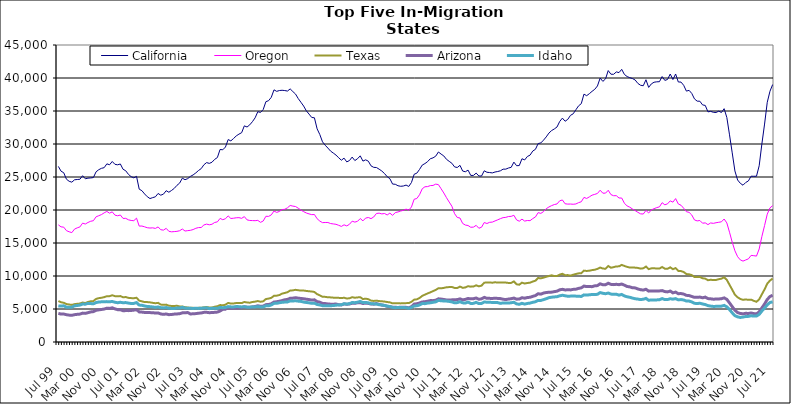
| Category | California | Oregon | Texas | Arizona | Idaho |
|---|---|---|---|---|---|
| Jul 99 | 26605 | 17749 | 6209 | 4339 | 5471 |
| Aug 99 | 25882 | 17447 | 6022 | 4228 | 5444 |
| Sep 99 | 25644 | 17401 | 5941 | 4237 | 5488 |
| Oct 99 | 24669 | 16875 | 5751 | 4134 | 5279 |
| Nov 99 | 24353 | 16701 | 5680 | 4073 | 5260 |
| Dec 99 | 24218 | 16570 | 5619 | 4042 | 5269 |
| Jan 00 | 24574 | 17109 | 5736 | 4142 | 5485 |
| Feb 00 | 24620 | 17295 | 5789 | 4192 | 5530 |
| Mar 00 | 24655 | 17436 | 5826 | 4226 | 5590 |
| Apr 00 | 25195 | 18009 | 5980 | 4375 | 5748 |
| May 00 | 24730 | 17875 | 5897 | 4337 | 5729 |
| Jun 00 | 24825 | 18113 | 6070 | 4444 | 5853 |
| Jul 00 | 24857 | 18294 | 6163 | 4555 | 5824 |
| Aug 00 | 24913 | 18376 | 6199 | 4603 | 5788 |
| Sep 00 | 25792 | 18971 | 6529 | 4804 | 5976 |
| Oct 00 | 26106 | 19135 | 6643 | 4870 | 6058 |
| Nov 00 | 26315 | 19306 | 6705 | 4926 | 6085 |
| Dec 00 | 26415 | 19570 | 6793 | 4991 | 6096 |
| Jan 01 | 26995 | 19781 | 6942 | 5122 | 6119 |
| Feb 01 | 26851 | 19519 | 6948 | 5089 | 6090 |
| Mar 01 | 27352 | 19720 | 7080 | 5180 | 6143 |
| Apr 01 | 26918 | 19221 | 6943 | 5020 | 6020 |
| May 01 | 26848 | 19126 | 6924 | 4899 | 5950 |
| Jun 01 | 26974 | 19241 | 6959 | 4895 | 6019 |
| Jul 01 | 26172 | 18725 | 6778 | 4737 | 5951 |
| Aug 01 | 25943 | 18736 | 6810 | 4757 | 5973 |
| Sep 01 | 25399 | 18514 | 6688 | 4753 | 5895 |
| Oct 01 | 25050 | 18415 | 6650 | 4780 | 5833 |
| Nov 01 | 24873 | 18381 | 6631 | 4826 | 5850 |
| Dec 01 | 25099 | 18765 | 6708 | 4898 | 5969 |
| Jan 02 | 23158 | 17561 | 6261 | 4560 | 5595 |
| Feb 02 | 22926 | 17573 | 6162 | 4531 | 5560 |
| Mar 02 | 22433 | 17452 | 6052 | 4481 | 5458 |
| Apr 02 | 22012 | 17314 | 6046 | 4458 | 5380 |
| May 02 | 21733 | 17267 | 6007 | 4452 | 5358 |
| Jun 02 | 21876 | 17298 | 5933 | 4444 | 5315 |
| Jul 02 | 21997 | 17209 | 5873 | 4383 | 5243 |
| Aug 02 | 22507 | 17436 | 5929 | 4407 | 5315 |
| Sep 02 | 22244 | 17010 | 5672 | 4248 | 5192 |
| Oct 02 | 22406 | 16952 | 5625 | 4191 | 5167 |
| Nov 02 | 22922 | 17223 | 5663 | 4242 | 5221 |
| Dec 02 | 22693 | 16770 | 5499 | 4142 | 5120 |
| Jan 03 | 22964 | 16694 | 5463 | 4166 | 5089 |
| Feb 03 | 23276 | 16727 | 5461 | 4226 | 5077 |
| Mar 03 | 23736 | 16766 | 5486 | 4251 | 5145 |
| Apr 03 | 24079 | 16859 | 5389 | 4289 | 5145 |
| May 03 | 24821 | 17117 | 5378 | 4415 | 5254 |
| Jun 03 | 24592 | 16812 | 5273 | 4426 | 5135 |
| Jul 03 | 24754 | 16875 | 5226 | 4466 | 5124 |
| Aug 03 | 25092 | 16922 | 5181 | 4244 | 5100 |
| Sep 03 | 25316 | 17036 | 5181 | 4279 | 5086 |
| Oct 03 | 25622 | 17228 | 5139 | 4301 | 5110 |
| Nov 03 | 25984 | 17335 | 5175 | 4362 | 5091 |
| Dec 03 | 26269 | 17350 | 5189 | 4396 | 5113 |
| Jan 04 | 26852 | 17734 | 5255 | 4492 | 5152 |
| Feb 04 | 27184 | 17860 | 5301 | 4502 | 5183 |
| Mar 04 | 27062 | 17757 | 5227 | 4443 | 5056 |
| Apr 04 | 27238 | 17840 | 5227 | 4461 | 5104 |
| May 04 | 27671 | 18113 | 5345 | 4493 | 5095 |
| Jun 04 | 27949 | 18201 | 5416 | 4532 | 5103 |
| Jul 04 | 29172 | 18727 | 5597 | 4697 | 5231 |
| Aug 04 | 29122 | 18529 | 5561 | 4945 | 5197 |
| Sep 04 | 29542 | 18678 | 5656 | 4976 | 5237 |
| Oct 04 | 30674 | 19108 | 5922 | 5188 | 5363 |
| Nov 04 | 30472 | 18716 | 5823 | 5106 | 5321 |
| Dec 04 | 30831 | 18755 | 5838 | 5135 | 5312 |
| Jan 05 | 31224 | 18823 | 5906 | 5155 | 5374 |
| Feb 05 | 31495 | 18842 | 5898 | 5168 | 5357 |
| Mar 05 | 31714 | 18738 | 5894 | 5212 | 5313 |
| Apr 05 | 32750 | 18998 | 6060 | 5340 | 5350 |
| May 05 | 32575 | 18504 | 5989 | 5269 | 5276 |
| Jun 05 | 32898 | 18414 | 5954 | 5252 | 5271 |
| Jul 05 | 33384 | 18395 | 6062 | 5322 | 5322 |
| Aug 05 | 33964 | 18381 | 6113 | 5375 | 5316 |
| Sep 05 | 34897 | 18426 | 6206 | 5493 | 5362 |
| Oct 05 | 34780 | 18132 | 6100 | 5408 | 5308 |
| Nov 05 | 35223 | 18332 | 6162 | 5434 | 5314 |
| Dec 05 | 36415 | 19047 | 6508 | 5658 | 5487 |
| Jan 06 | 36567 | 19032 | 6576 | 5688 | 5480 |
| Feb 06 | 37074 | 19257 | 6692 | 5792 | 5616 |
| Mar 06 | 38207 | 19845 | 6993 | 6052 | 5850 |
| Apr 06 | 37976 | 19637 | 7024 | 6101 | 5864 |
| May 06 | 38099 | 19781 | 7114 | 6178 | 5943 |
| Jun 06 | 38141 | 20061 | 7331 | 6276 | 6018 |
| Jul 06 | 38097 | 20111 | 7431 | 6399 | 6046 |
| Aug 06 | 38021 | 20333 | 7542 | 6450 | 6064 |
| Sep 06 | 38349 | 20686 | 7798 | 6627 | 6232 |
| Oct 06 | 37947 | 20591 | 7825 | 6647 | 6216 |
| Nov 06 | 37565 | 20526 | 7907 | 6707 | 6244 |
| Dec 06 | 36884 | 20272 | 7840 | 6648 | 6192 |
| Jan 07 | 36321 | 19984 | 7789 | 6597 | 6151 |
| Feb 07 | 35752 | 19752 | 7799 | 6554 | 6048 |
| Mar 07 | 35025 | 19547 | 7737 | 6487 | 5989 |
| Apr 07 | 34534 | 19412 | 7685 | 6430 | 5937 |
| May 07 | 34022 | 19296 | 7654 | 6353 | 5858 |
| Jun 07 | 33974 | 19318 | 7577 | 6390 | 5886 |
| Jul 07 | 32298 | 18677 | 7250 | 6117 | 5682 |
| Aug 07 | 31436 | 18322 | 7070 | 6034 | 5617 |
| Sep 07 | 30331 | 18087 | 6853 | 5847 | 5500 |
| Oct 07 | 29813 | 18108 | 6839 | 5821 | 5489 |
| Nov 07 | 29384 | 18105 | 6777 | 5769 | 5481 |
| Dec 07 | 28923 | 17949 | 6760 | 5733 | 5499 |
| Jan 08 | 28627 | 17890 | 6721 | 5732 | 5521 |
| Feb 08 | 28328 | 17834 | 6719 | 5749 | 5579 |
| Mar 08 | 27911 | 17680 | 6690 | 5650 | 5614 |
| Apr 08 | 27543 | 17512 | 6656 | 5612 | 5635 |
| May 08 | 27856 | 17754 | 6705 | 5774 | 5798 |
| Jun 08 | 27287 | 17589 | 6593 | 5717 | 5745 |
| Jul 08 | 27495 | 17834 | 6623 | 5761 | 5807 |
| Aug 08 | 28018 | 18309 | 6789 | 5867 | 5982 |
| Sep-08 | 27491 | 18164 | 6708 | 5864 | 5954 |
| Oct 08 | 27771 | 18291 | 6755 | 5942 | 6032 |
| Nov 08 | 28206 | 18706 | 6787 | 5970 | 6150 |
| Dec 08 | 27408 | 18353 | 6505 | 5832 | 5975 |
| Jan 09 | 27601 | 18778 | 6569 | 5890 | 5995 |
| Feb 09 | 27394 | 18863 | 6483 | 5845 | 5936 |
| Mar 09 | 26690 | 18694 | 6273 | 5751 | 5806 |
| Apr 09 | 26461 | 18943 | 6222 | 5735 | 5777 |
| May 09 | 26435 | 19470 | 6272 | 5819 | 5767 |
| Jun 09 | 26187 | 19522 | 6199 | 5700 | 5649 |
| Jul 09 | 25906 | 19408 | 6171 | 5603 | 5617 |
| Aug 09 | 25525 | 19469 | 6128 | 5533 | 5540 |
| Sep 09 | 25050 | 19249 | 6059 | 5405 | 5437 |
| Oct 09 | 24741 | 19529 | 6004 | 5349 | 5369 |
| Nov 09 | 23928 | 19187 | 5854 | 5271 | 5248 |
| Dec 09 | 23899 | 19607 | 5886 | 5261 | 5195 |
| Jan 10 | 23676 | 19703 | 5881 | 5232 | 5234 |
| Feb 10 | 23592 | 19845 | 5850 | 5272 | 5236 |
| Mar 10 | 23634 | 19946 | 5864 | 5278 | 5219 |
| Apr 10 | 23774 | 20134 | 5889 | 5257 | 5201 |
| May 10 | 23567 | 19966 | 5897 | 5172 | 5105 |
| Jun 10 | 24166 | 20464 | 6087 | 5356 | 5237 |
| Jul 10 | 25410 | 21627 | 6417 | 5742 | 5452 |
| Aug 10 | 25586 | 21744 | 6465 | 5797 | 5491 |
| Sep 10 | 26150 | 22314 | 6667 | 5907 | 5609 |
| Oct 10 | 26807 | 23219 | 6986 | 6070 | 5831 |
| Nov 10 | 27033 | 23520 | 7179 | 6100 | 5810 |
| Dec 10 | 27332 | 23551 | 7361 | 6182 | 5898 |
| Jan 11 | 27769 | 23697 | 7525 | 6276 | 5938 |
| Feb 11 | 27898 | 23718 | 7708 | 6267 | 6016 |
| Mar 11 | 28155 | 23921 | 7890 | 6330 | 6081 |
| Apr 11 | 28790 | 23847 | 8146 | 6544 | 6305 |
| May 11 | 28471 | 23215 | 8131 | 6502 | 6248 |
| Jun 11 | 28191 | 22580 | 8199 | 6445 | 6217 |
| Jul 11 | 27678 | 21867 | 8291 | 6368 | 6202 |
| Aug 11 | 27372 | 21203 | 8321 | 6356 | 6146 |
| Sep 11 | 27082 | 20570 | 8341 | 6387 | 6075 |
| Oct 11 | 26528 | 19442 | 8191 | 6402 | 5932 |
| Nov 11 | 26440 | 18872 | 8176 | 6426 | 5968 |
| Dec 11 | 26770 | 18784 | 8401 | 6533 | 6106 |
| Jan 12 | 25901 | 17963 | 8202 | 6390 | 5933 |
| Feb 12 | 25796 | 17718 | 8266 | 6456 | 5900 |
| Mar 12 | 26042 | 17647 | 8456 | 6600 | 6054 |
| Apr 12 | 25239 | 17386 | 8388 | 6534 | 5838 |
| May 12 | 25238 | 17407 | 8401 | 6558 | 5854 |
| Jun 12 | 25593 | 17673 | 8594 | 6669 | 6009 |
| Jul 12 | 25155 | 17237 | 8432 | 6474 | 5817 |
| Aug 12 | 25146 | 17391 | 8536 | 6539 | 5842 |
| Sep 12 | 25942 | 18102 | 8989 | 6759 | 6061 |
| Oct 12 | 25718 | 17953 | 9012 | 6618 | 6027 |
| Nov 12 | 25677 | 18134 | 9032 | 6611 | 6009 |
| Dec 12 | 25619 | 18166 | 8981 | 6601 | 5999 |
| Jan 13 | 25757 | 18344 | 9051 | 6627 | 5989 |
| Feb-13 | 25830 | 18512 | 9001 | 6606 | 5968 |
| Mar-13 | 25940 | 18689 | 9021 | 6577 | 5853 |
| Apr 13 | 26187 | 18844 | 9013 | 6478 | 5925 |
| May 13 | 26192 | 18884 | 9003 | 6431 | 5924 |
| Jun-13 | 26362 | 19013 | 8948 | 6508 | 5896 |
| Jul 13 | 26467 | 19037 | 8958 | 6559 | 5948 |
| Aug 13 | 27253 | 19198 | 9174 | 6655 | 6020 |
| Sep 13 | 26711 | 18501 | 8747 | 6489 | 5775 |
| Oct 13 | 26733 | 18301 | 8681 | 6511 | 5711 |
| Nov 13 | 27767 | 18620 | 8989 | 6709 | 5860 |
| Dec 13 | 27583 | 18320 | 8863 | 6637 | 5740 |
| Jan 14 | 28107 | 18409 | 8939 | 6735 | 5843 |
| Feb-14 | 28313 | 18383 | 8989 | 6779 | 5893 |
| Mar 14 | 28934 | 18696 | 9160 | 6918 | 6015 |
| Apr 14 | 29192 | 18946 | 9291 | 7036 | 6099 |
| May 14 | 30069 | 19603 | 9701 | 7314 | 6304 |
| Jun 14 | 30163 | 19487 | 9641 | 7252 | 6293 |
| Jul-14 | 30587 | 19754 | 9752 | 7415 | 6427 |
| Aug-14 | 31074 | 20201 | 9882 | 7499 | 6557 |
| Sep 14 | 31656 | 20459 | 9997 | 7536 | 6719 |
| Oct 14 | 32037 | 20663 | 10109 | 7555 | 6786 |
| Nov 14 | 32278 | 20825 | 9992 | 7628 | 6831 |
| Dec 14 | 32578 | 20918 | 10006 | 7705 | 6860 |
| Jan 15 | 33414 | 21396 | 10213 | 7906 | 7000 |
| Feb 15 | 33922 | 21518 | 10337 | 7982 | 7083 |
| Mar 15 | 33447 | 20942 | 10122 | 7891 | 7006 |
| Apr-15 | 33731 | 20893 | 10138 | 7906 | 6931 |
| May 15 | 34343 | 20902 | 10053 | 7895 | 6952 |
| Jun-15 | 34572 | 20870 | 10192 | 7973 | 6966 |
| Jul 15 | 35185 | 20916 | 10303 | 8000 | 6949 |
| Aug 15 | 35780 | 21115 | 10399 | 8126 | 6938 |
| Sep 15 | 36109 | 21246 | 10428 | 8207 | 6896 |
| Oct 15 | 37555 | 21908 | 10813 | 8477 | 7140 |
| Nov 15 | 37319 | 21750 | 10763 | 8390 | 7112 |
| Dec 15 | 37624 | 21990 | 10807 | 8395 | 7149 |
| Jan 16 | 37978 | 22248 | 10892 | 8388 | 7201 |
| Feb 16 | 38285 | 22369 | 10951 | 8508 | 7192 |
| Mar 16 | 38792 | 22506 | 11075 | 8547 | 7226 |
| Apr 16 | 39994 | 22999 | 11286 | 8815 | 7487 |
| May 16 | 39488 | 22548 | 11132 | 8673 | 7382 |
| Jun 16 | 39864 | 22556 | 11100 | 8682 | 7315 |
| Jul 16 | 41123 | 22989 | 11516 | 8903 | 7420 |
| Aug 16 | 40573 | 22333 | 11251 | 8731 | 7261 |
| Sep 16 | 40560 | 22162 | 11340 | 8692 | 7216 |
| Oct 16 | 40923 | 22172 | 11456 | 8742 | 7233 |
| Nov 16 | 40817 | 21818 | 11459 | 8685 | 7101 |
| Dec 16 | 41311 | 21815 | 11681 | 8783 | 7203 |
| Jan 17 | 40543 | 21029 | 11524 | 8609 | 6982 |
| Feb 17 | 40218 | 20613 | 11385 | 8416 | 6852 |
| Mar 17 | 40052 | 20425 | 11276 | 8354 | 6775 |
| Apr 17 | 39913 | 20147 | 11297 | 8218 | 6653 |
| May 17 | 39695 | 19910 | 11265 | 8196 | 6552 |
| Jun 17 | 39177 | 19650 | 11225 | 8034 | 6500 |
| Jul 17 | 38901 | 19419 | 11115 | 7923 | 6429 |
| Aug 17 | 38827 | 19389 | 11168 | 7867 | 6479 |
| Sep 17 | 39736 | 19936 | 11426 | 7991 | 6609 |
| Oct 17 | 38576 | 19547 | 11041 | 7708 | 6315 |
| Nov 17 | 39108 | 20013 | 11158 | 7746 | 6381 |
| Dec 17 | 39359 | 20202 | 11185 | 7743 | 6366 |
| Jan 18 | 39420 | 20362 | 11118 | 7736 | 6380 |
| Feb 18 | 39440 | 20476 | 11128 | 7741 | 6407 |
| Mar 18 | 40218 | 21106 | 11362 | 7789 | 6578 |
| Apr 18 | 39637 | 20788 | 11111 | 7642 | 6423 |
| May 18 | 39777 | 20933 | 11097 | 7591 | 6430 |
| Jun 18 | 40602 | 21381 | 11317 | 7721 | 6554 |
| Jul 18 | 39767 | 21189 | 11038 | 7445 | 6489 |
| Aug 18 | 40608 | 21729 | 11200 | 7560 | 6569 |
| Sep 18 | 39395 | 20916 | 10772 | 7318 | 6383 |
| Oct 18 | 39383 | 20724 | 10740 | 7344 | 6429 |
| Nov 18 | 38891 | 20265 | 10605 | 7255 | 6365 |
| Dec 18 | 38013 | 19741 | 10292 | 7069 | 6205 |
| Jan 19 | 38130 | 19643 | 10261 | 7032 | 6203 |
| Feb 19 | 37658 | 19237 | 10132 | 6892 | 6073 |
| Mar 19 | 36831 | 18492 | 9848 | 6766 | 5863 |
| Apr 19 | 36492 | 18349 | 9839 | 6763 | 5827 |
| May 19 | 36481 | 18407 | 9867 | 6809 | 5873 |
| Jun 19 | 35925 | 17998 | 9661 | 6698 | 5761 |
| Jul 19 | 35843 | 18049 | 9598 | 6800 | 5673 |
| Aug 19 | 34870 | 17785 | 9361 | 6577 | 5512 |
| Sep 19 | 34945 | 18038 | 9428 | 6547 | 5437 |
| Oct 19 | 34802 | 17977 | 9385 | 6483 | 5390 |
| Nov 19 | 34775 | 18072 | 9403 | 6511 | 5401 |
| Dec 19 | 34976 | 18140 | 9518 | 6521 | 5419 |
| Jan 20 | 34774 | 18209 | 9594 | 6561 | 5434 |
| Feb 20 | 35352 | 18632 | 9804 | 6682 | 5543 |
| Mar 20 | 34013 | 18041 | 9411 | 6464 | 5330 |
| Apr 20 | 31385 | 16629 | 8666 | 5922 | 4906 |
| May 20 | 28657 | 15123 | 7927 | 5355 | 4419 |
| Jun 20 | 25915 | 13817 | 7164 | 4815 | 3992 |
| Jul 20 | 24545 | 12926 | 6776 | 4457 | 3810 |
| Aug 20 | 24048 | 12443 | 6521 | 4326 | 3720 |
| Sep 20 | 23756 | 12258 | 6386 | 4266 | 3784 |
| Oct 20 | 24166 | 12429 | 6452 | 4347 | 3861 |
| Nov 20 | 24404 | 12597 | 6386 | 4324 | 3883 |
| Dec 20 | 25120 | 13122 | 6420 | 4394 | 3974 |
| Jan 21 | 25111 | 13080 | 6236 | 4304 | 3924 |
| Feb 21 | 25114 | 13015 | 6094 | 4260 | 3930 |
| Mar 21 | 26701 | 14096 | 6455 | 4567 | 4185 |
| Apr 21 | 29998 | 15978 | 7222 | 5164 | 4697 |
| May 21 | 33020 | 17641 | 7969 | 5748 | 5148 |
| Jun 21 | 36320 | 19369 | 8840 | 6450 | 5628 |
| Jul 21 | 37989 | 20320 | 9306 | 6877 | 5984 |
| Aug 21 | 39007 | 20657 | 9615 | 7094 | 6084 |